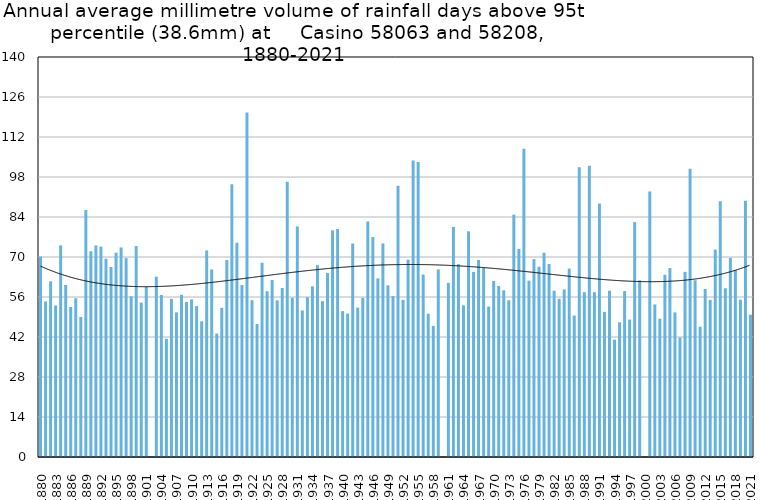
| Category | Annual average mm in days above 95th percentile |
|---|---|
| 1880 | 70.175 |
| 1881 | 54.433 |
| 1882 | 61.48 |
| 1883 | 53.025 |
| 1884 | 74.08 |
| 1885 | 60.2 |
| 1886 | 52.5 |
| 1887 | 55.579 |
| 1888 | 49.02 |
| 1889 | 86.443 |
| 1890 | 72.017 |
| 1891 | 74.05 |
| 1892 | 73.644 |
| 1893 | 69.4 |
| 1894 | 66.517 |
| 1895 | 71.533 |
| 1896 | 73.35 |
| 1897 | 69.6 |
| 1898 | 56.233 |
| 1899 | 73.8 |
| 1900 | 54.043 |
| 1901 | 59.525 |
| 1902 | 0 |
| 1903 | 63.14 |
| 1904 | 56.733 |
| 1905 | 41.4 |
| 1906 | 55.362 |
| 1907 | 50.633 |
| 1908 | 56.775 |
| 1909 | 54.267 |
| 1910 | 55.15 |
| 1911 | 52.825 |
| 1912 | 47.486 |
| 1913 | 72.3 |
| 1914 | 65.65 |
| 1915 | 43.2 |
| 1916 | 52.212 |
| 1917 | 68.938 |
| 1918 | 95.5 |
| 1919 | 74.98 |
| 1920 | 60.16 |
| 1921 | 120.567 |
| 1922 | 54.9 |
| 1923 | 46.567 |
| 1924 | 68 |
| 1925 | 58.033 |
| 1926 | 61.967 |
| 1927 | 54.82 |
| 1928 | 59.133 |
| 1929 | 96.3 |
| 1930 | 55.738 |
| 1931 | 80.7 |
| 1932 | 51.3 |
| 1933 | 55.933 |
| 1934 | 59.729 |
| 1935 | 67.167 |
| 1936 | 54.533 |
| 1937 | 64.389 |
| 1938 | 79.338 |
| 1939 | 79.78 |
| 1940 | 51.05 |
| 1941 | 50.2 |
| 1942 | 74.725 |
| 1943 | 52.325 |
| 1944 | 55.7 |
| 1945 | 82.417 |
| 1946 | 76.962 |
| 1947 | 62.514 |
| 1948 | 74.743 |
| 1949 | 60.1 |
| 1950 | 56.333 |
| 1951 | 94.967 |
| 1952 | 55 |
| 1953 | 69.089 |
| 1954 | 103.8 |
| 1955 | 103.22 |
| 1956 | 63.86 |
| 1957 | 50.133 |
| 1958 | 45.883 |
| 1959 | 65.643 |
| 1960 | 0 |
| 1961 | 60.96 |
| 1962 | 80.545 |
| 1963 | 67.489 |
| 1964 | 53.083 |
| 1965 | 79 |
| 1966 | 64.8 |
| 1967 | 68.988 |
| 1968 | 66.244 |
| 1969 | 52.65 |
| 1970 | 61.633 |
| 1971 | 59.875 |
| 1972 | 58.356 |
| 1973 | 54.88 |
| 1974 | 84.82 |
| 1975 | 72.85 |
| 1976 | 107.88 |
| 1977 | 61.725 |
| 1978 | 69.25 |
| 1979 | 66.6 |
| 1980 | 71.5 |
| 1981 | 67.56 |
| 1982 | 58.2 |
| 1983 | 55.4 |
| 1984 | 58.667 |
| 1985 | 65.957 |
| 1986 | 49.533 |
| 1987 | 101.433 |
| 1988 | 57.693 |
| 1989 | 101.975 |
| 1990 | 57.68 |
| 1991 | 88.7 |
| 1992 | 50.8 |
| 1993 | 58.2 |
| 1994 | 41.067 |
| 1995 | 47.133 |
| 1996 | 58.075 |
| 1997 | 48.1 |
| 1998 | 82.2 |
| 1999 | 61.85 |
| 2000 | 0 |
| 2001 | 92.9 |
| 2002 | 53.4 |
| 2003 | 48.4 |
| 2004 | 63.8 |
| 2005 | 66.12 |
| 2006 | 50.622 |
| 2007 | 41.8 |
| 2008 | 64.8 |
| 2009 | 100.9 |
| 2010 | 61.875 |
| 2011 | 45.6 |
| 2012 | 58.833 |
| 2013 | 54.98 |
| 2014 | 72.6 |
| 2015 | 89.5 |
| 2016 | 59.067 |
| 2017 | 69.709 |
| 2018 | 65.45 |
| 2019 | 55.067 |
| 2020 | 89.7 |
| 2021 | 49.8 |